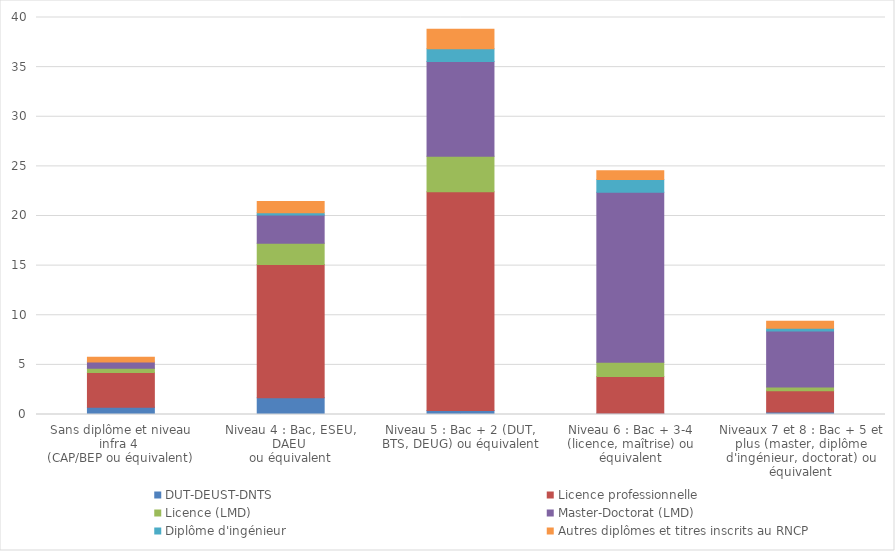
| Category | DUT-DEUST-DNTS | Licence professionnelle | Licence (LMD) | Master-Doctorat (LMD) | Diplôme d'ingénieur | Autres diplômes et titres inscrits au RNCP |
|---|---|---|---|---|---|---|
| Sans diplôme et niveau infra 4 
(CAP/BEP ou équivalent) | 0.72 | 3.517 | 0.412 | 0.637 | 0 | 0.471 |
| Niveau 4 : Bac, ESEU, DAEU 
ou équivalent | 1.689 | 13.431 | 2.132 | 2.852 | 0.222 | 1.135 |
| Niveau 5 : Bac + 2 (DUT, BTS, DEUG) ou équivalent | 0.415 | 22.016 | 3.6 | 9.526 | 1.302 | 1.966 |
| Niveau 6 : Bac + 3-4 (licence, maîtrise) ou équivalent | 0.138 | 3.683 | 1.44 | 17.142 | 1.274 | 0.886 |
| Niveaux 7 et 8 : Bac + 5 et plus (master, diplôme d'ingénieur, doctorat) ou équivalent | 0.249 | 2.132 | 0.388 | 5.649 | 0.277 | 0.692 |